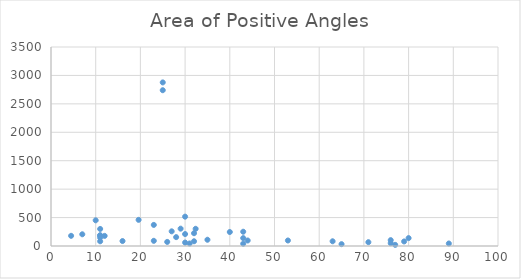
| Category | Series 0 |
|---|---|
| 32.36 | 302.3 |
| 4.5 | 179 |
| 30.0 | 516 |
| 19.6 | 460 |
| 7.0 | 206 |
| 65.0 | 32.4 |
| 43.0 | 251 |
| 30.0 | 210 |
| 25.0 | 2877 |
| 63.0 | 83 |
| 71.0 | 67 |
| 25.0 | 2740 |
| 89.0 | 44 |
| 40.0 | 246 |
| 11.0 | 83 |
| 32.0 | 225 |
| 26.0 | 72 |
| 23.0 | 371 |
| 23.0 | 91 |
| 44.0 | 97 |
| 11.0 | 300 |
| 76.0 | 103 |
| 11.0 | 190 |
| 35.0 | 110 |
| 77.0 | 20 |
| 16.0 | 87 |
| 32.0 | 83 |
| 76.0 | 50 |
| 10.0 | 452 |
| 27.0 | 258 |
| 43.0 | 139 |
| 31.0 | 44 |
| 30.0 | 61 |
| 29.0 | 305 |
| 11.0 | 182 |
| 11.0 | 147 |
| 43.0 | 40 |
| 79.0 | 80 |
| 28.0 | 156 |
| 53.0 | 97 |
| 80.0 | 139 |
| 12.0 | 178 |